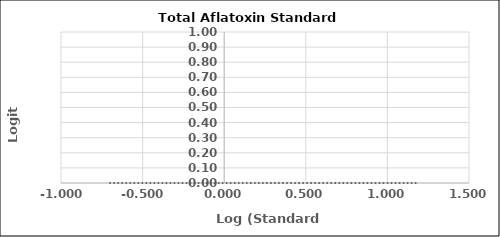
| Category | Series 0 |
|---|---|
| -0.6989700043360187 | 0 |
| -0.2218487496163564 | 0 |
| 0.25527250510330607 | 0 |
| 0.6989700043360189 | 0 |
| 1.1760912590556813 | 0 |